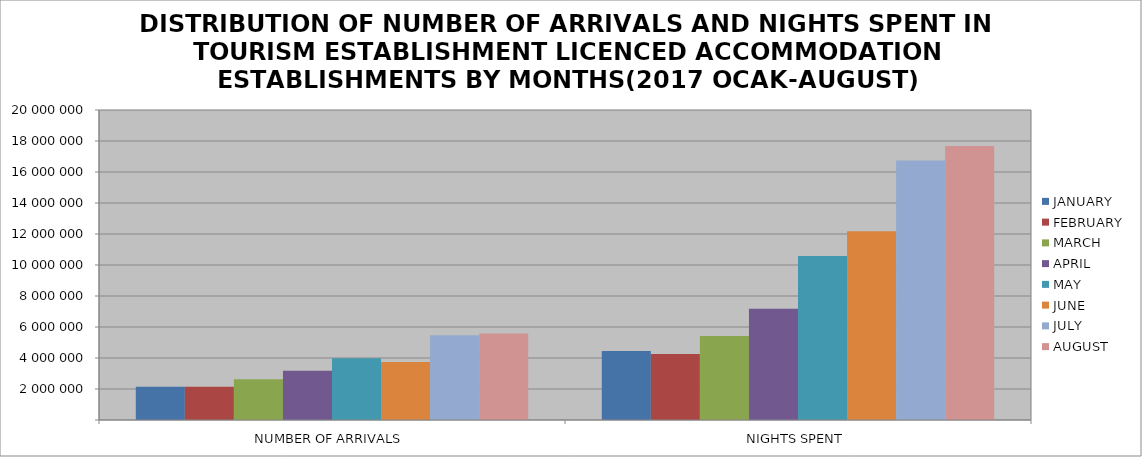
| Category | JANUARY | FEBRUARY | MARCH | APRIL | MAY | JUNE | JULY | AUGUST |
|---|---|---|---|---|---|---|---|---|
| NUMBER OF ARRIVALS | 2146994 | 2141043 | 2629734 | 3173381 | 3978651 | 3742131 | 5470767 | 5580002 |
| NIGHTS SPENT | 4457352 | 4260377 | 5413903 | 7176325 | 10579158 | 12172370 | 16748728 | 17679357 |